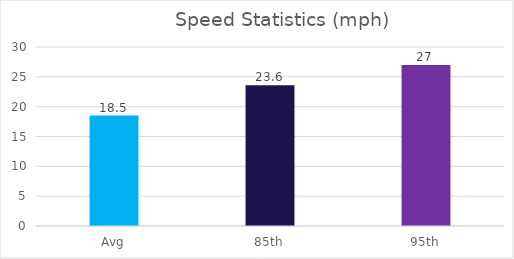
| Category | Series 0 |
|---|---|
| Avg | 18.5 |
| 85th | 23.6 |
| 95th | 27 |